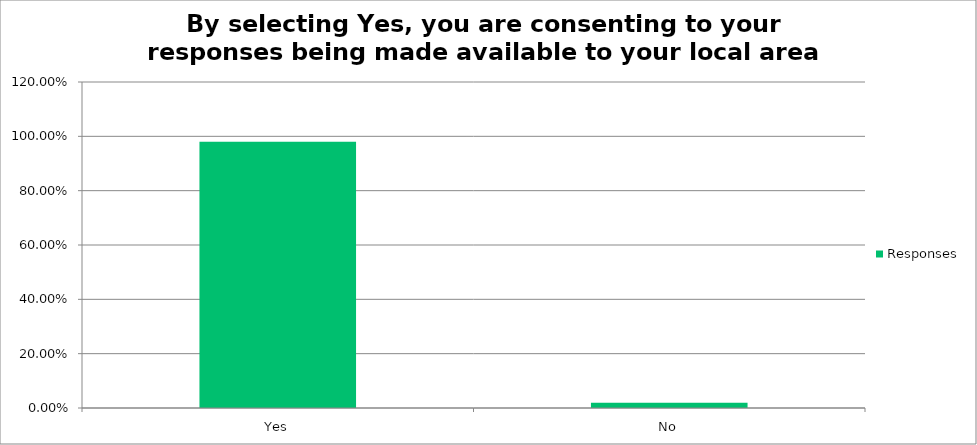
| Category | Responses |
|---|---|
| Yes | 0.98 |
| No | 0.02 |